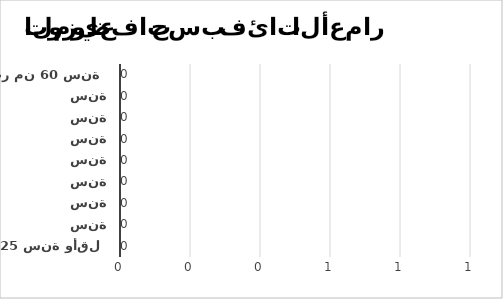
| Category | Series 1 |
|---|---|
| 25 سنة وأقل | 0 |
| ما بين 26 و30 سنة | 0 |
| ما بين 31 و35 سنة | 0 |
| ما بين 36 و40 سنة | 0 |
| ما بين 41 و45 سنة | 0 |
| ما بين 46 و50 سنة | 0 |
| ما بين 51 و55 سنة | 0 |
| ما بين 56 و60 سنة | 0 |
| أكثر من 60 سنة | 0 |